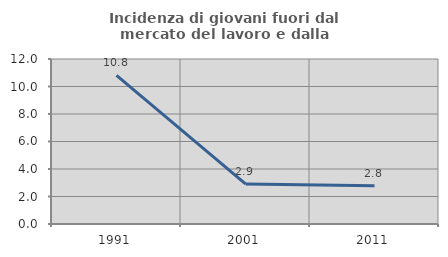
| Category | Incidenza di giovani fuori dal mercato del lavoro e dalla formazione  |
|---|---|
| 1991.0 | 10.811 |
| 2001.0 | 2.913 |
| 2011.0 | 2.778 |